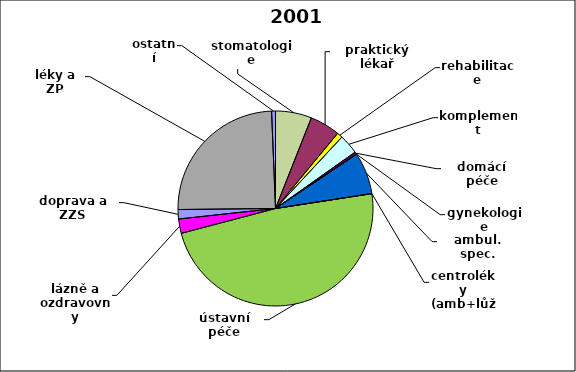
| Category | Series 0 |
|---|---|
| stomatologie | 0.06 |
| praktický lékař | 0.05 |
| rehabilitace | 0.009 |
| komplement | 0.033 |
| domácí péče | 0.004 |
| gynekologie | 0 |
| ambul. spec. | 0.07 |
| centroléky (amb+lůž) | 0 |
| ústavní péče | 0.483 |
| lázně a ozdravovny | 0.024 |
| doprava a ZZS | 0.016 |
| léky a ZP | 0.245 |
| ostatní | 0.006 |